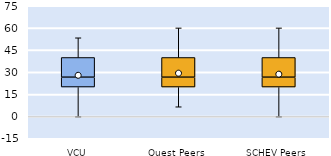
| Category | 25th | 50th | 75th |
|---|---|---|---|
| VCU | 20 | 6.667 | 13.333 |
| Quest Peers | 20 | 6.667 | 13.333 |
| SCHEV Peers | 20 | 6.667 | 13.333 |